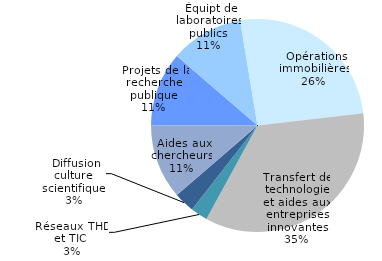
| Category | Series 0 |
|---|---|
|  Projets de la recherche publique | 0.113 |
|  Équipt de laboratoires publics | 0.111 |
|  Opérations immobilières | 0.258 |
| Transfert de technologie et aides aux entreprises innovantes | 0.348 |
| Réseaux THD et TIC  | 0.026 |
|  Diffusion culture scientifique | 0.031 |
|  Aides aux chercheurs | 0.113 |